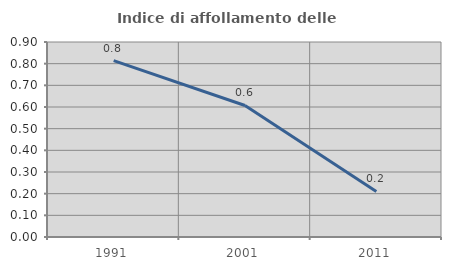
| Category | Indice di affollamento delle abitazioni  |
|---|---|
| 1991.0 | 0.814 |
| 2001.0 | 0.607 |
| 2011.0 | 0.21 |